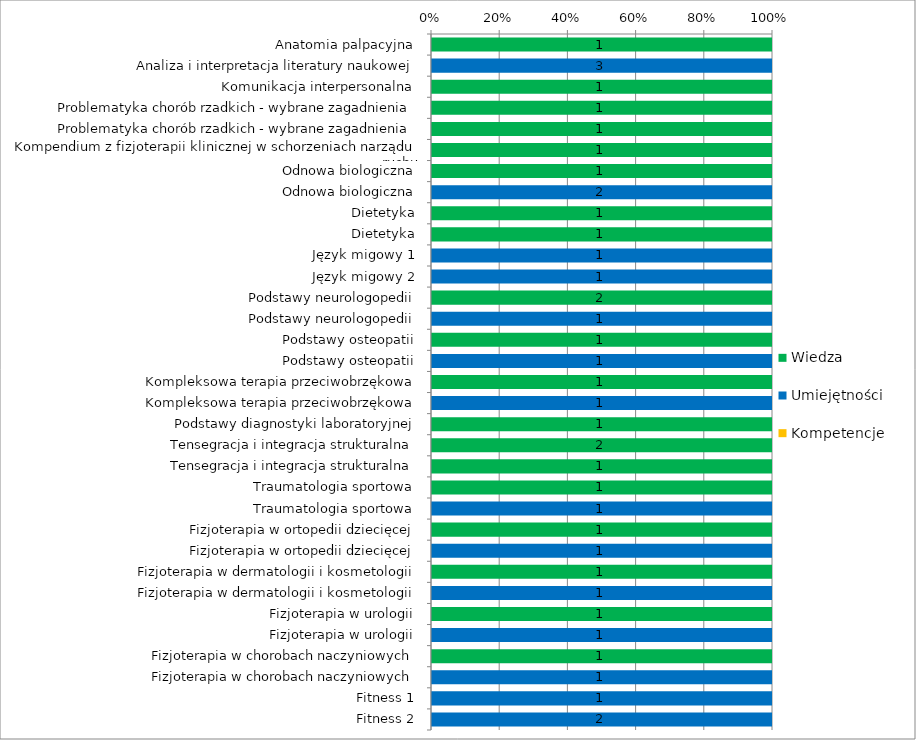
| Category | Wiedza | Umiejętności | Kompetencje |
|---|---|---|---|
| Anatomia palpacyjna | 1 | 0 | 0 |
| Analiza i interpretacja literatury naukowej | 0 | 3 | 0 |
| Komunikacja interpersonalna | 1 | 0 | 0 |
| Problematyka chorób rzadkich - wybrane zagadnienia | 1 | 0 | 0 |
| Problematyka chorób rzadkich - wybrane zagadnienia | 1 | 0 | 0 |
| Kompendium z fizjoterapii klinicznej w schorzeniach narządu ruchu | 1 | 0 | 0 |
| Odnowa biologiczna | 1 | 0 | 0 |
| Odnowa biologiczna | 0 | 2 | 0 |
| Dietetyka | 1 | 0 | 0 |
| Dietetyka | 1 | 0 | 0 |
| Język migowy 1 | 0 | 1 | 0 |
| Język migowy 2 | 0 | 1 | 0 |
| Podstawy neurologopedii | 2 | 0 | 0 |
| Podstawy neurologopedii | 0 | 1 | 0 |
| Podstawy osteopatii | 1 | 0 | 0 |
| Podstawy osteopatii | 0 | 1 | 0 |
| Kompleksowa terapia przeciwobrzękowa | 1 | 0 | 0 |
| Kompleksowa terapia przeciwobrzękowa | 0 | 1 | 0 |
| Podstawy diagnostyki laboratoryjnej | 1 | 0 | 0 |
| Tensegracja i integracja strukturalna | 2 | 0 | 0 |
| Tensegracja i integracja strukturalna | 1 | 0 | 0 |
| Traumatologia sportowa | 1 | 0 | 0 |
| Traumatologia sportowa | 0 | 1 | 0 |
| Fizjoterapia w ortopedii dziecięcej | 1 | 0 | 0 |
| Fizjoterapia w ortopedii dziecięcej | 0 | 1 | 0 |
| Fizjoterapia w dermatologii i kosmetologii | 1 | 0 | 0 |
| Fizjoterapia w dermatologii i kosmetologii | 0 | 1 | 0 |
| Fizjoterapia w urologii | 1 | 0 | 0 |
| Fizjoterapia w urologii | 0 | 1 | 0 |
| Fizjoterapia w chorobach naczyniowych | 1 | 0 | 0 |
| Fizjoterapia w chorobach naczyniowych | 0 | 1 | 0 |
| Fitness 1 | 0 | 1 | 0 |
| Fitness 2 | 0 | 2 | 0 |